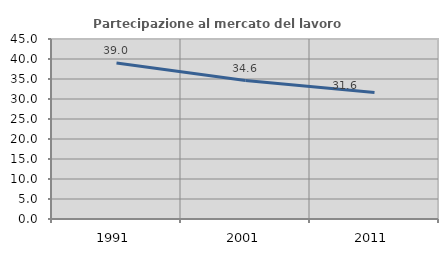
| Category | Partecipazione al mercato del lavoro  femminile |
|---|---|
| 1991.0 | 39.006 |
| 2001.0 | 34.615 |
| 2011.0 | 31.606 |